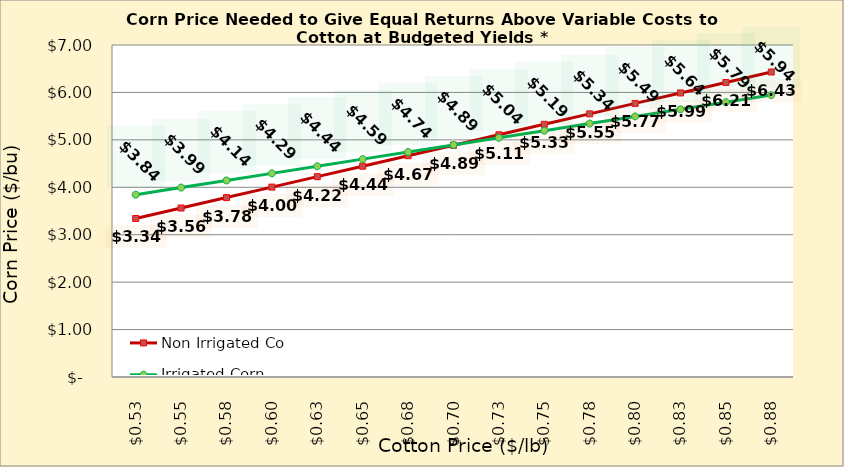
| Category | Non Irrigated Corn | Irrigated Corn |
|---|---|---|
| 0.5249999999999998 | 3.342 | 3.844 |
| 0.5499999999999998 | 3.563 | 3.994 |
| 0.5749999999999998 | 3.783 | 4.144 |
| 0.5999999999999999 | 4.004 | 4.294 |
| 0.6249999999999999 | 4.224 | 4.444 |
| 0.6499999999999999 | 4.445 | 4.594 |
| 0.6749999999999999 | 4.666 | 4.744 |
| 0.7 | 4.886 | 4.894 |
| 0.725 | 5.107 | 5.044 |
| 0.75 | 5.327 | 5.194 |
| 0.775 | 5.548 | 5.344 |
| 0.8 | 5.769 | 5.494 |
| 0.8250000000000001 | 5.989 | 5.644 |
| 0.8500000000000001 | 6.21 | 5.794 |
| 0.8750000000000001 | 6.43 | 5.944 |